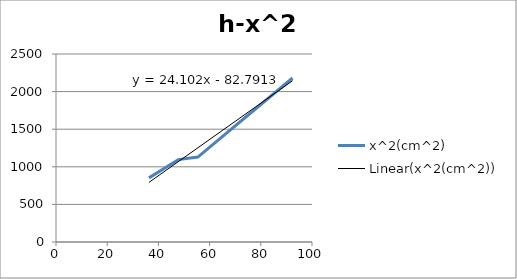
| Category | x^2(cm^2) |
|---|---|
| 92.4 | 2180.89 |
| 55.4 | 1128.96 |
| 47.8 | 1095.61 |
| 36.3 | 852.64 |